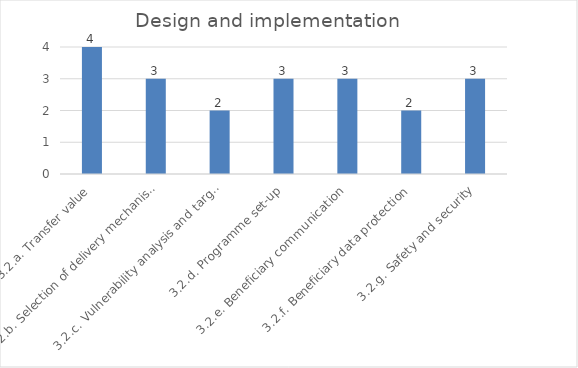
| Category | Design and implementation |
|---|---|
| 3.2.a. Transfer value | 4 |
| 3.2.b. Selection of delivery mechanism | 3 |
| 3.2.c. Vulnerability analysis and targeting | 2 |
| 3.2.d. Programme set-up | 3 |
| 3.2.e. Beneficiary communication | 3 |
| 3.2.f. Beneficiary data protection | 2 |
| 3.2.g. Safety and security | 3 |